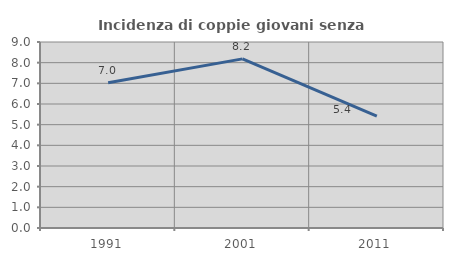
| Category | Incidenza di coppie giovani senza figli |
|---|---|
| 1991.0 | 7.026 |
| 2001.0 | 8.184 |
| 2011.0 | 5.412 |